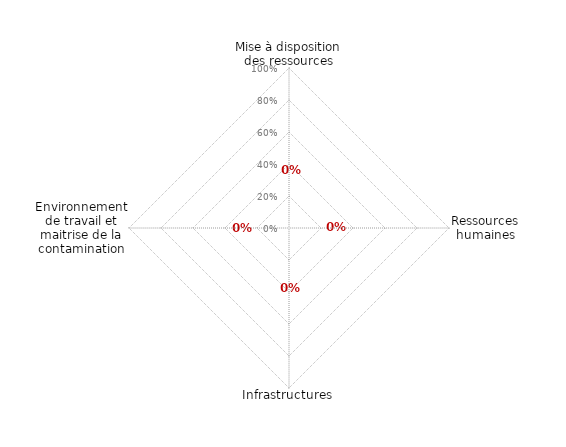
| Category | article 6 |
|---|---|
| 0 | 0 |
| 1 | 0 |
| 2 | 0 |
| 3 | 0 |